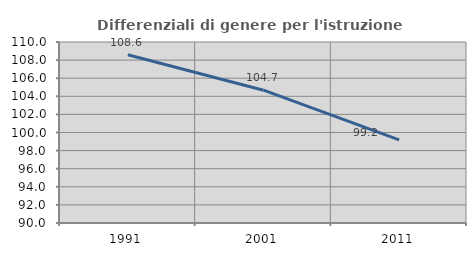
| Category | Differenziali di genere per l'istruzione superiore |
|---|---|
| 1991.0 | 108.584 |
| 2001.0 | 104.674 |
| 2011.0 | 99.177 |